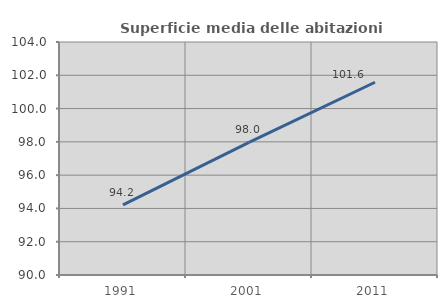
| Category | Superficie media delle abitazioni occupate |
|---|---|
| 1991.0 | 94.213 |
| 2001.0 | 97.964 |
| 2011.0 | 101.583 |